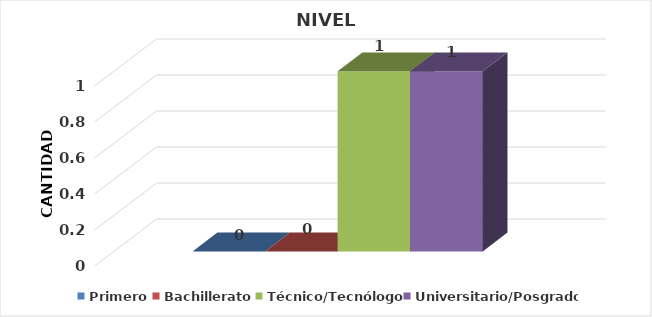
| Category | Primero | Bachillerato | Técnico/Tecnólogo | Universitario/Posgrado |
|---|---|---|---|---|
| 0 | 0 | 0 | 1 | 1 |